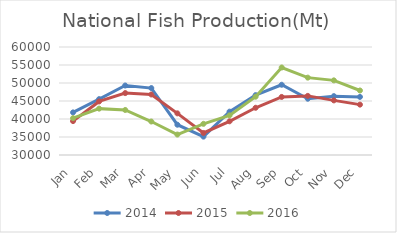
| Category | 2014 | 2015 | 2016 |
|---|---|---|---|
| Jan | 41830 | 39420 | 40230 |
| Feb | 45520 | 44880 | 42880 |
| Mar | 49300 | 47200 | 42510 |
| Apr | 48590 | 46810 | 39300 |
| May | 38410 | 41570 | 35680 |
| Jun | 35100 | 36120 | 38660 |
| Jul | 42040 | 39360 | 41010 |
| Aug | 46630 | 43120 | 46200 |
| Sep | 49510 | 46130 | 54310 |
| Oct | 45630 | 46420 | 51490 |
| Nov | 46350 | 45170 | 50730 |
| Dec | 46140 | 43990 | 47920 |